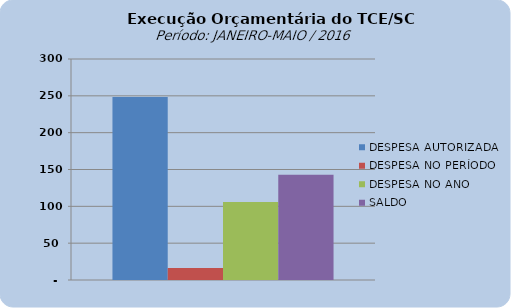
| Category | DESPESA AUTORIZADA | DESPESA NO PERÍODO | DESPESA NO ANO | SALDO |
|---|---|---|---|---|
| 0 | 248501917.3 | 16206614.82 | 105738539.63 | 142763377.67 |